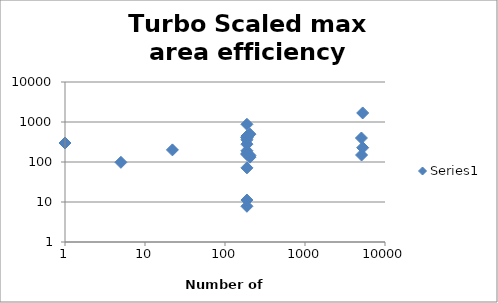
| Category | Series 0 |
|---|---|
| 5263.0 | 1682.424 |
| 5075.0 | 397.99 |
| 5263.0 | 228.038 |
| 205.0 | 496.911 |
| 188.0 | 406.827 |
| 188.0 | 875.294 |
| 188.0 | 359.499 |
| 205.0 | 146.156 |
| 188.0 | 7.812 |
| 5092.0 | 149.375 |
| 205.0 | 132 |
| 188.0 | 190.965 |
| 188.0 | 444.482 |
| 22.0 | 200.917 |
| 188.0 | 279.221 |
| 188.0 | 154.217 |
| 188.0 | 406.827 |
| 188.0 | 71.429 |
| 188.0 | 163.636 |
| 188.0 | 11.194 |
| 5.0 | 98.173 |
| 1.0 | 298.459 |